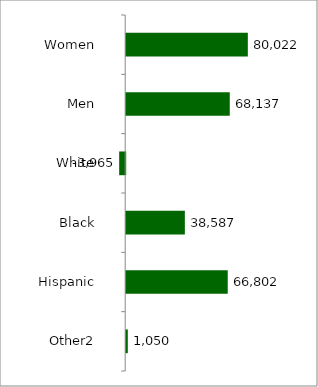
| Category | 50 states and D.C. |
|---|---|
| Women | 80022 |
| Men | 68137 |
| White | -3965 |
| Black | 38587 |
| Hispanic | 66802 |
| Other2 | 1050 |